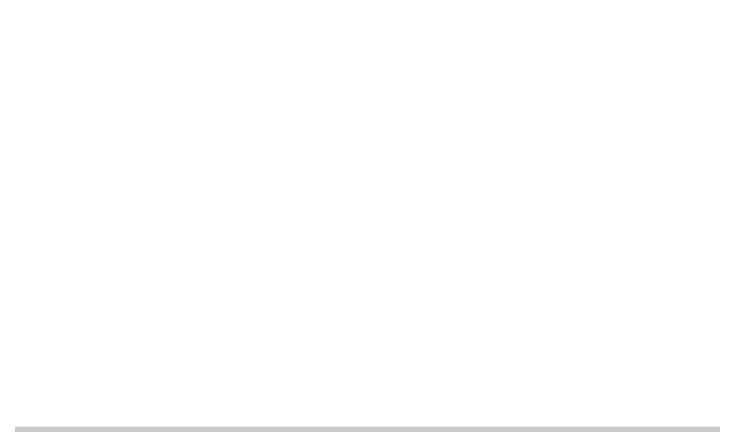
| Category | Series 0 | Series 1 | Series 2 |
|---|---|---|---|
| 0.0 | 3963.327 | 49.833 | 0 |
| 10.0 | 3963.327 | 49.833 | 0 |
| 90.0 | 3963.327 | 49.833 | 0 |
| 100.0 | 3963.327 | 49.833 | 0 |